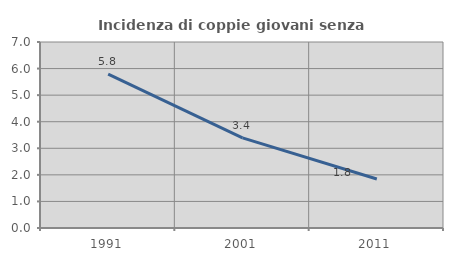
| Category | Incidenza di coppie giovani senza figli |
|---|---|
| 1991.0 | 5.792 |
| 2001.0 | 3.39 |
| 2011.0 | 1.843 |